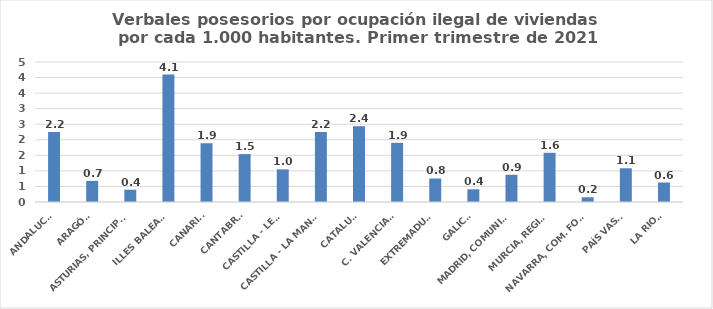
| Category | 616 |
|---|---|
| ANDALUCÍA | 2.247 |
| ARAGÓN | 0.679 |
| ASTURIAS, PRINCIPADO | 0.395 |
| ILLES BALEARS | 4.094 |
| CANARIAS | 1.888 |
| CANTABRIA | 1.54 |
| CASTILLA - LEÓN | 1.05 |
| CASTILLA - LA MANCHA | 2.246 |
| CATALUÑA | 2.437 |
| C. VALENCIANA | 1.901 |
| EXTREMADURA | 0.756 |
| GALICIA | 0.408 |
| MADRID, COMUNIDAD | 0.875 |
| MURCIA, REGIÓN | 1.581 |
| NAVARRA, COM. FORAL | 0.151 |
| PAÍS VASCO | 1.085 |
| LA RIOJA | 0.627 |